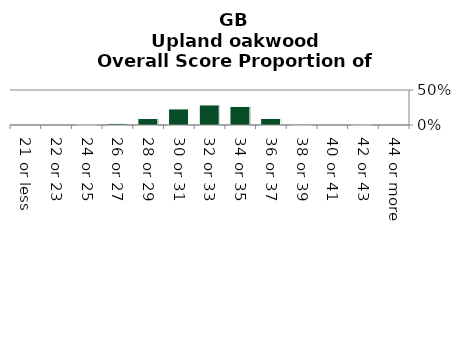
| Category | Upland oakwood |
|---|---|
| 21 or less | 0 |
| 22 or 23 | 0 |
| 24 or 25 | 0.002 |
| 26 or 27 | 0.019 |
| 28 or 29 | 0.093 |
| 30 or 31 | 0.229 |
| 32 or 33 | 0.286 |
| 34 or 35 | 0.265 |
| 36 or 37 | 0.093 |
| 38 or 39 | 0.012 |
| 40 or 41 | 0 |
| 42 or 43 | 0.001 |
| 44 or more | 0 |